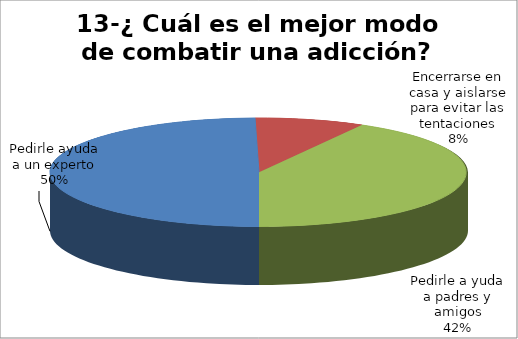
| Category | Series 0 |
|---|---|
| Pedirle ayuda a un experto | 164 |
| Encerrarse en casa y aislarse para evitar las tentaciones | 28 |
| Pedirle a yuda a padres y amigos | 138 |